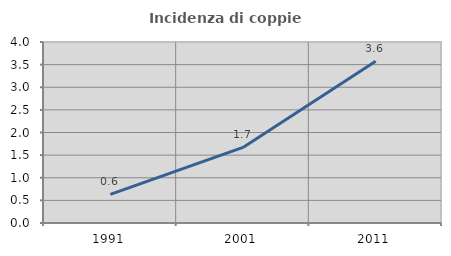
| Category | Incidenza di coppie miste |
|---|---|
| 1991.0 | 0.631 |
| 2001.0 | 1.67 |
| 2011.0 | 3.575 |